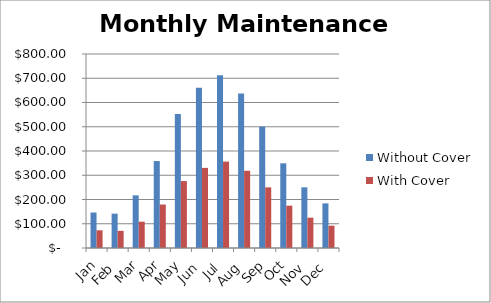
| Category | Without Cover | With Cover |
|---|---|---|
| Jan | 146.279 | 73.139 |
| Feb | 141.56 | 70.78 |
| Mar | 217.059 | 108.529 |
| Apr | 358.619 | 179.31 |
| May | 552.085 | 276.042 |
| Jun | 660.614 | 330.307 |
| Jul | 712.519 | 356.26 |
| Aug | 637.021 | 318.51 |
| Sep | 500.179 | 250.09 |
| Oct | 349.182 | 174.591 |
| Nov | 250.09 | 125.045 |
| Dec | 184.028 | 92.014 |